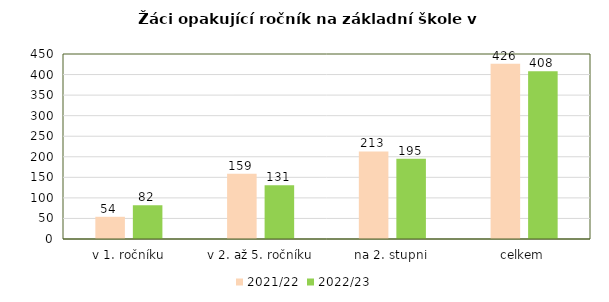
| Category | 2021/22 | 2022/23 |
|---|---|---|
| v 1. ročníku | 54 | 82 |
| v 2. až 5. ročníku | 159 | 131 |
| na 2. stupni | 213 | 195 |
| celkem | 426 | 408 |